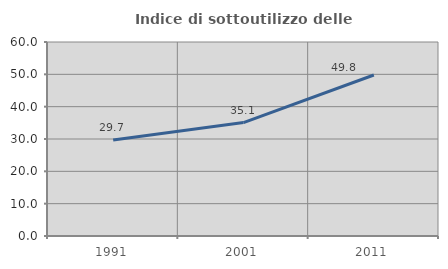
| Category | Indice di sottoutilizzo delle abitazioni  |
|---|---|
| 1991.0 | 29.659 |
| 2001.0 | 35.088 |
| 2011.0 | 49.799 |